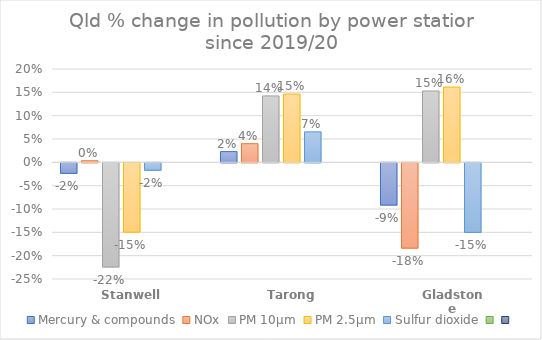
| Category | Mercury & compounds | NOx | PM 10μm | PM 2.5μm | Sulfur dioxide | Series 5 | Series 6 |
|---|---|---|---|---|---|---|---|
| Stanwell | -0.023 | 0.003 | -0.223 | -0.149 | -0.016 |  |  |
| Tarong | 0.023 | 0.04 | 0.142 | 0.146 | 0.065 |  |  |
| Gladstone | -0.091 | -0.183 | 0.153 | 0.161 | -0.149 |  |  |